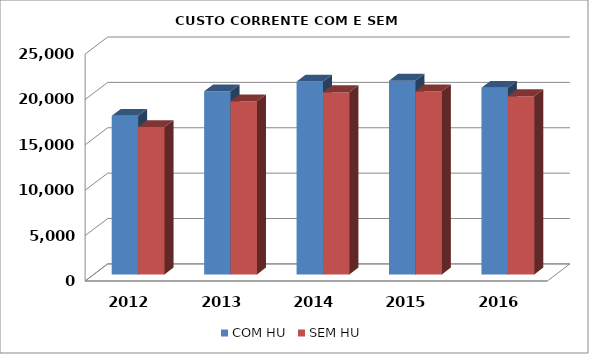
| Category | COM HU | SEM HU |
|---|---|---|
| 2012.0 | 17475.435 | 16230.538 |
| 2013.0 | 20177.473 | 19070.638 |
| 2014.0 | 21246.593 | 20079.471 |
| 2015.0 | 21344.567 | 20168.413 |
| 2016.0 | 20556.186 | 19635.871 |